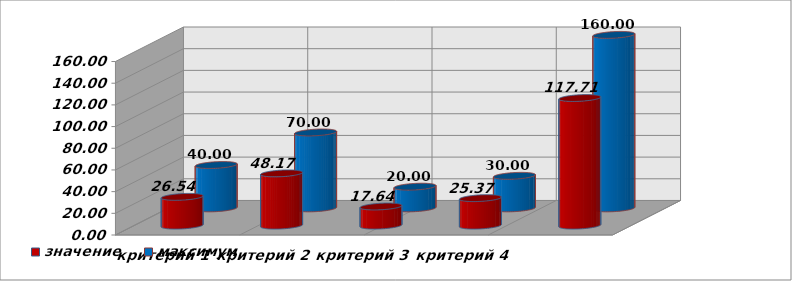
| Category | значение | максимум |
|---|---|---|
| критерий 1 | 26.536 | 40 |
| критерий 2 | 48.169 | 70 |
| критерий 3 | 17.643 | 20 |
| критерий 4 | 25.366 | 30 |